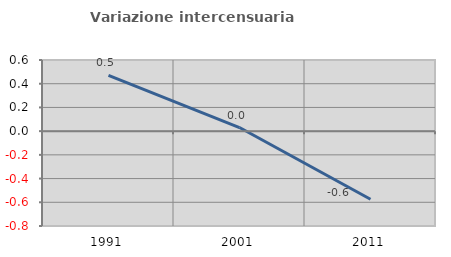
| Category | Variazione intercensuaria annua |
|---|---|
| 1991.0 | 0.469 |
| 2001.0 | 0.03 |
| 2011.0 | -0.574 |